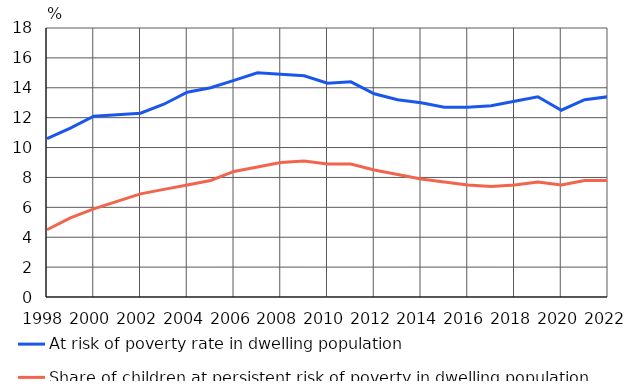
| Category | At risk of poverty rate in dwelling population | Share of children at persistent risk of poverty in dwelling population 1) |
|---|---|---|
| 1998 | 10.6 | 4.5 |
| 1999 | 11.3 | 5.3 |
| 2000 | 12.1 | 5.9 |
| 2001 | 12.2 | 6.4 |
| 2002 | 12.3 | 6.9 |
| 2003 | 12.9 | 7.2 |
| 2004 | 13.7 | 7.5 |
| 2005 | 14 | 7.8 |
| 2006 | 14.5 | 8.4 |
| 2007 | 15 | 8.7 |
| 2008 | 14.9 | 9 |
| 2009 | 14.8 | 9.1 |
| 2010 | 14.3 | 8.9 |
| 2011 | 14.4 | 8.9 |
| 2012 | 13.6 | 8.5 |
| 2013 | 13.2 | 8.2 |
| 2014 | 13 | 7.9 |
| 2015 | 12.7 | 7.7 |
| 2016 | 12.7 | 7.5 |
| 2017 | 12.8 | 7.4 |
| 2018 | 13.1 | 7.5 |
| 2019 | 13.4 | 7.7 |
| 2020 | 12.5 | 7.5 |
| 2021 | 13.2 | 7.8 |
| 2022 | 13.4 | 7.8 |